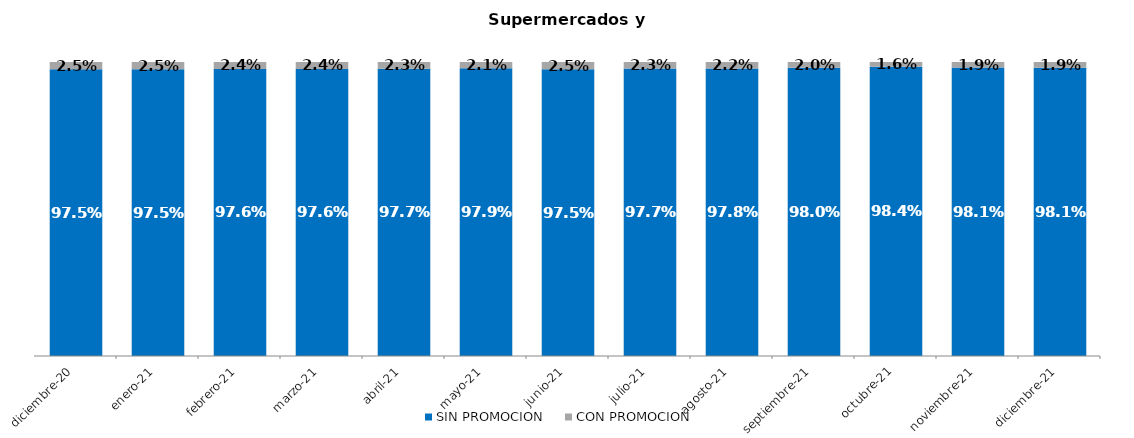
| Category | SIN PROMOCION   | CON PROMOCION   |
|---|---|---|
| 2020-12-01 | 0.975 | 0.025 |
| 2021-01-01 | 0.975 | 0.025 |
| 2021-02-01 | 0.976 | 0.024 |
| 2021-03-01 | 0.976 | 0.024 |
| 2021-04-01 | 0.977 | 0.023 |
| 2021-05-01 | 0.979 | 0.021 |
| 2021-06-01 | 0.975 | 0.025 |
| 2021-07-01 | 0.977 | 0.023 |
| 2021-08-01 | 0.978 | 0.022 |
| 2021-09-01 | 0.98 | 0.02 |
| 2021-10-01 | 0.984 | 0.016 |
| 2021-11-01 | 0.981 | 0.019 |
| 2021-12-01 | 0.981 | 0.019 |